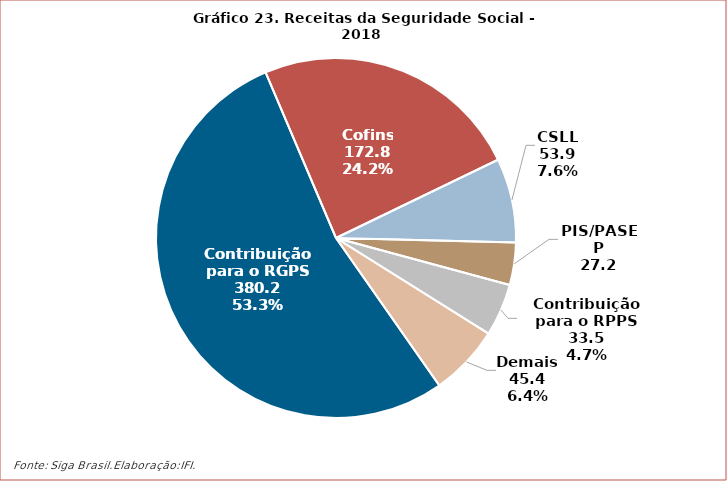
| Category | Receita Arrecadada Líquida |
|---|---|
| Contribuição para o RGPS | 380.242 |
| Cofins | 172.836 |
| CSLL | 53.86 |
| PIS/PASEP | 27.239 |
| Contribuição para o RPPS | 33.493 |
| Demais | 45.424 |